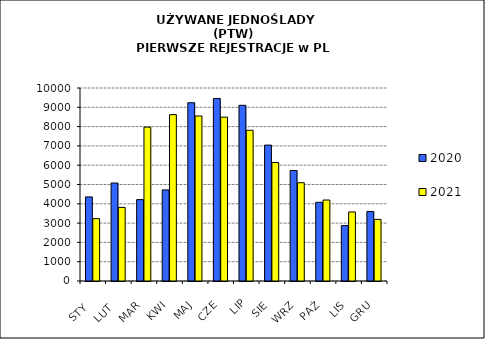
| Category | 2020 | 2021 |
|---|---|---|
|  STY  | 4356 | 3231 |
|  LUT  | 5076 | 3813 |
| MAR | 4217 | 7974 |
| KWI | 4719 | 8620 |
| MAJ | 9236 | 8550 |
| CZE | 9457 | 8490 |
| LIP | 9103 | 7810 |
| SIE | 7041 | 6142 |
| WRZ | 5724 | 5092 |
| PAŹ | 4077 | 4196 |
| LIS | 2870 | 3577 |
| GRU | 3600 | 3193 |